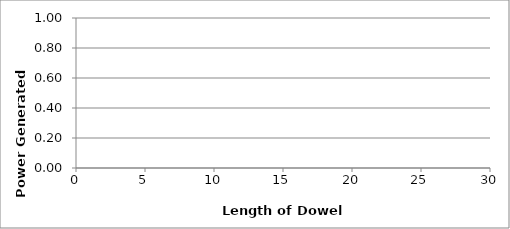
| Category | Power vs. Dowel Length |
|---|---|
| 0.0 | 0 |
| 0.0 | 0 |
| 0.0 | 0 |
| 0.0 | 0 |
| 0.0 | 0 |
| 0.0 | 0 |
| 0.0 | 0 |
| 0.0 | 0 |
| 0.0 | 0 |
| 0.0 | 0 |
| 0.0 | 0 |
| 0.0 | 0 |
| 0.0 | 0 |
| 0.0 | 0 |
| 0.0 | 0 |
| 0.0 | 0 |
| 0.0 | 0 |
| 0.0 | 0 |
| 0.0 | 0 |
| 0.0 | 0 |
| 0.0 | 0 |
| 0.0 | 0 |
| 0.0 | 0 |
| 0.0 | 0 |